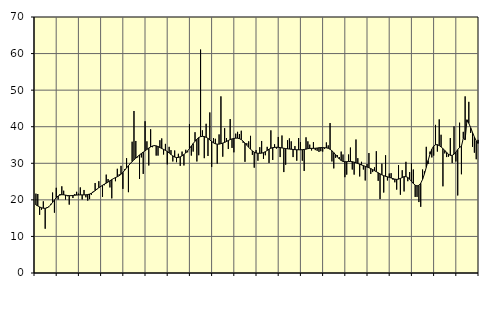
| Category | Piggar | Series 1 |
|---|---|---|
| nan | 21.7 | 18.6 |
| 1.0 | 21.6 | 18.35 |
| 1.0 | 15.9 | 18.06 |
| 1.0 | 17.3 | 17.84 |
| 1.0 | 19.6 | 17.71 |
| 1.0 | 12.1 | 17.68 |
| 1.0 | 18 | 17.81 |
| 1.0 | 18 | 18.14 |
| 1.0 | 18.9 | 18.66 |
| 1.0 | 22 | 19.3 |
| 1.0 | 16.5 | 19.98 |
| 1.0 | 23.3 | 20.6 |
| nan | 20.1 | 21.06 |
| 2.0 | 21.6 | 21.32 |
| 2.0 | 23.7 | 21.41 |
| 2.0 | 22.5 | 21.38 |
| 2.0 | 20.1 | 21.29 |
| 2.0 | 21 | 21.19 |
| 2.0 | 18.7 | 21.15 |
| 2.0 | 21.1 | 21.15 |
| 2.0 | 20.5 | 21.2 |
| 2.0 | 21.6 | 21.26 |
| 2.0 | 22.2 | 21.31 |
| 2.0 | 21.7 | 21.35 |
| nan | 23.4 | 21.35 |
| 3.0 | 20.1 | 21.36 |
| 3.0 | 22.7 | 21.36 |
| 3.0 | 20.7 | 21.38 |
| 3.0 | 19.8 | 21.44 |
| 3.0 | 20.2 | 21.58 |
| 3.0 | 21.4 | 21.81 |
| 3.0 | 22.3 | 22.14 |
| 3.0 | 24.6 | 22.52 |
| 3.0 | 23 | 22.93 |
| 3.0 | 25.1 | 23.32 |
| 3.0 | 23.5 | 23.67 |
| nan | 20.8 | 23.99 |
| 4.0 | 24 | 24.29 |
| 4.0 | 26.9 | 24.57 |
| 4.0 | 25.7 | 24.87 |
| 4.0 | 23.4 | 25.21 |
| 4.0 | 20.4 | 25.54 |
| 4.0 | 25.9 | 25.84 |
| 4.0 | 25.1 | 26.09 |
| 4.0 | 28.5 | 26.32 |
| 4.0 | 27 | 26.6 |
| 4.0 | 29.3 | 26.99 |
| 4.0 | 23 | 27.51 |
| nan | 28.4 | 28.11 |
| 5.0 | 31.4 | 28.73 |
| 5.0 | 22.1 | 29.35 |
| 5.0 | 30.1 | 29.92 |
| 5.0 | 35.9 | 30.44 |
| 5.0 | 44.3 | 30.94 |
| 5.0 | 36.1 | 31.4 |
| 5.0 | 31.6 | 31.86 |
| 5.0 | 25.7 | 32.29 |
| 5.0 | 31.6 | 32.68 |
| 5.0 | 27.1 | 33.05 |
| 5.0 | 41.5 | 33.41 |
| nan | 36 | 33.79 |
| 6.0 | 29.4 | 34.16 |
| 6.0 | 39.3 | 34.47 |
| 6.0 | 34.4 | 34.73 |
| 6.0 | 35 | 34.83 |
| 6.0 | 32.1 | 34.77 |
| 6.0 | 32.1 | 34.58 |
| 6.0 | 36.3 | 34.32 |
| 6.0 | 36.8 | 34.05 |
| 6.0 | 32.4 | 33.8 |
| 6.0 | 35.3 | 33.53 |
| 6.0 | 29.7 | 33.23 |
| nan | 34.5 | 32.83 |
| 7.0 | 33.6 | 32.4 |
| 7.0 | 30.5 | 32.03 |
| 7.0 | 33.5 | 31.71 |
| 7.0 | 30.3 | 31.55 |
| 7.0 | 32.6 | 31.6 |
| 7.0 | 29.3 | 31.77 |
| 7.0 | 33.2 | 32.03 |
| 7.0 | 29.4 | 32.39 |
| 7.0 | 33.7 | 32.83 |
| 7.0 | 33 | 33.4 |
| 7.0 | 40.7 | 34.03 |
| nan | 32.1 | 34.71 |
| 8.0 | 33.2 | 35.4 |
| 8.0 | 38.5 | 36.03 |
| 8.0 | 30.5 | 36.59 |
| 8.0 | 32.2 | 37.03 |
| 8.0 | 61.1 | 37.29 |
| 8.0 | 39 | 37.37 |
| 8.0 | 31.4 | 37.31 |
| 8.0 | 40.8 | 37.1 |
| 8.0 | 32 | 36.8 |
| 8.0 | 43.9 | 36.4 |
| 8.0 | 29 | 35.97 |
| nan | 36.9 | 35.58 |
| 9.0 | 36.7 | 35.34 |
| 9.0 | 29.9 | 35.23 |
| 9.0 | 37.9 | 35.24 |
| 9.0 | 48.3 | 35.37 |
| 9.0 | 31.8 | 35.53 |
| 9.0 | 39.6 | 35.71 |
| 9.0 | 36.9 | 35.96 |
| 9.0 | 33.9 | 36.24 |
| 9.0 | 42.1 | 36.48 |
| 9.0 | 34.2 | 36.67 |
| 9.0 | 33 | 36.79 |
| nan | 38.1 | 36.87 |
| 10.0 | 38.6 | 36.87 |
| 10.0 | 38 | 36.74 |
| 10.0 | 38.9 | 36.47 |
| 10.0 | 35.6 | 36.04 |
| 10.0 | 30.4 | 35.51 |
| 10.0 | 35.5 | 34.94 |
| 10.0 | 36 | 34.38 |
| 10.0 | 37.5 | 33.84 |
| 10.0 | 32.3 | 33.39 |
| 10.0 | 28.8 | 33.03 |
| 10.0 | 33.6 | 32.82 |
| nan | 30.7 | 32.74 |
| 11.0 | 34.4 | 32.73 |
| 11.0 | 36.1 | 32.77 |
| 11.0 | 31.2 | 32.91 |
| 11.0 | 32.2 | 33.17 |
| 11.0 | 34.5 | 33.52 |
| 11.0 | 30.1 | 33.86 |
| 11.0 | 39 | 34.12 |
| 11.0 | 30.9 | 34.27 |
| 11.0 | 35.2 | 34.34 |
| 11.0 | 34 | 34.38 |
| 11.0 | 37.2 | 34.37 |
| nan | 31.7 | 34.3 |
| 12.0 | 37.6 | 34.2 |
| 12.0 | 27.6 | 34.11 |
| 12.0 | 29.6 | 34.03 |
| 12.0 | 36.3 | 33.96 |
| 12.0 | 36.8 | 33.9 |
| 12.0 | 36 | 33.84 |
| 12.0 | 31.7 | 33.79 |
| 12.0 | 34.7 | 33.73 |
| 12.0 | 30.7 | 33.7 |
| 12.0 | 36.9 | 33.69 |
| 12.0 | 35.8 | 33.69 |
| nan | 30.7 | 33.72 |
| 13.0 | 27.9 | 33.78 |
| 13.0 | 37.1 | 33.87 |
| 13.0 | 36 | 34 |
| 13.0 | 35.1 | 34.07 |
| 13.0 | 33.5 | 34.08 |
| 13.0 | 35.8 | 34.08 |
| 13.0 | 33.6 | 34.11 |
| 13.0 | 33.4 | 34.17 |
| 13.0 | 33.1 | 34.24 |
| 13.0 | 33.3 | 34.29 |
| 13.0 | 33.2 | 34.28 |
| nan | 33.9 | 34.25 |
| 14.0 | 35.7 | 34.22 |
| 14.0 | 34.9 | 34.11 |
| 14.0 | 41 | 33.84 |
| 14.0 | 30.5 | 33.43 |
| 14.0 | 28.6 | 32.92 |
| 14.0 | 31.5 | 32.34 |
| 14.0 | 32.2 | 31.72 |
| 14.0 | 31.7 | 31.18 |
| 14.0 | 33.2 | 30.76 |
| 14.0 | 32.4 | 30.51 |
| 14.0 | 26.2 | 30.42 |
| nan | 26.9 | 30.44 |
| 15.0 | 32.4 | 30.48 |
| 15.0 | 34.3 | 30.49 |
| 15.0 | 28.3 | 30.43 |
| 15.0 | 26.9 | 30.31 |
| 15.0 | 36.5 | 30.15 |
| 15.0 | 31.4 | 29.95 |
| 15.0 | 26.4 | 29.75 |
| 15.0 | 30.4 | 29.55 |
| 15.0 | 28.3 | 29.36 |
| 15.0 | 25.3 | 29.17 |
| 15.0 | 29.8 | 28.97 |
| nan | 32.8 | 28.78 |
| 16.0 | 27.1 | 28.56 |
| 16.0 | 27.6 | 28.29 |
| 16.0 | 28.9 | 27.99 |
| 16.0 | 33.3 | 27.71 |
| 16.0 | 25.2 | 27.41 |
| 16.0 | 20.2 | 27.1 |
| 16.0 | 29.9 | 26.83 |
| 16.0 | 22 | 26.62 |
| 16.0 | 32.2 | 26.44 |
| 16.0 | 25.3 | 26.3 |
| 16.0 | 27.2 | 26.16 |
| nan | 27.3 | 25.99 |
| 17.0 | 25.5 | 25.8 |
| 17.0 | 24.8 | 25.66 |
| 17.0 | 22.8 | 25.6 |
| 17.0 | 29.5 | 25.67 |
| 17.0 | 21.4 | 25.86 |
| 17.0 | 28.1 | 26.12 |
| 17.0 | 22.3 | 26.34 |
| 17.0 | 30.4 | 26.35 |
| 17.0 | 25.1 | 26.13 |
| 17.0 | 27.6 | 25.66 |
| 17.0 | 30 | 25.07 |
| nan | 28.3 | 24.48 |
| 18.0 | 20.8 | 24.01 |
| 18.0 | 20.8 | 23.82 |
| 18.0 | 19.4 | 23.97 |
| 18.0 | 18.1 | 24.54 |
| 18.0 | 28.3 | 25.59 |
| 18.0 | 27.8 | 27.09 |
| 18.0 | 34.5 | 28.88 |
| 18.0 | 29.8 | 30.77 |
| 18.0 | 33.2 | 32.48 |
| 18.0 | 31.6 | 33.85 |
| 18.0 | 32.1 | 34.72 |
| nan | 40.5 | 35.08 |
| 19.0 | 33.2 | 35.09 |
| 19.0 | 42 | 34.85 |
| 19.0 | 37.8 | 34.47 |
| 19.0 | 23.7 | 34.03 |
| 19.0 | 32.7 | 33.51 |
| 19.0 | 31.7 | 32.97 |
| 19.0 | 31.8 | 32.48 |
| 19.0 | 36.9 | 32.18 |
| 19.0 | 30.1 | 32.16 |
| 19.0 | 40.1 | 32.48 |
| 19.0 | 30.5 | 33.06 |
| nan | 21.2 | 33.75 |
| 20.0 | 41.1 | 34.33 |
| 20.0 | 27 | 34.66 |
| 20.0 | 38.6 | 36.82 |
| 20.0 | 48.3 | 36.46 |
| 20.0 | 41.2 | 41.9 |
| 20.0 | 46.8 | 40.92 |
| 20.0 | 38.3 | 39.73 |
| 20.0 | 34.5 | 38.44 |
| 20.0 | 32.9 | 37.2 |
| 20.0 | 31.1 | 36.15 |
| 20.0 | 36.4 | 35.4 |